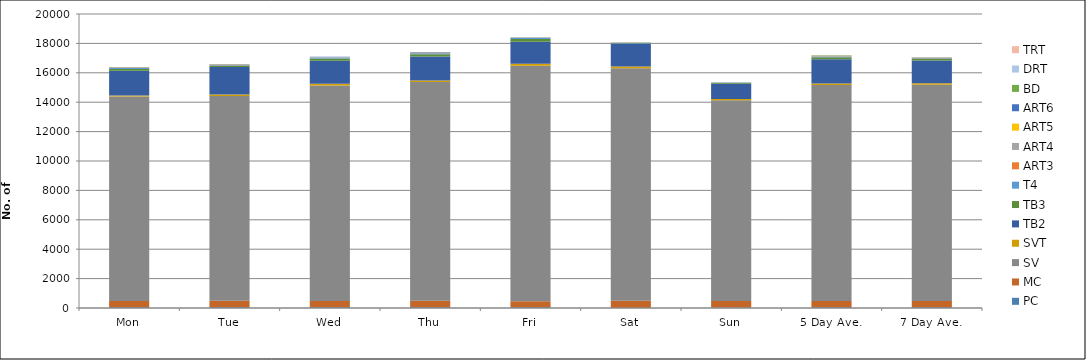
| Category | PC | MC | SV | SVT | TB2 | TB3 | T4 | ART3 | ART4 | ART5 | ART6 | BD | DRT | TRT |
|---|---|---|---|---|---|---|---|---|---|---|---|---|---|---|
| Mon | 45 | 426 | 13909 | 79 | 1683 | 112 | 65 | 19 | 21 | 14 | 17 | 1 | 2 | 1 |
| Tue | 51 | 435 | 13942 | 92 | 1880 | 70 | 45 | 24 | 28 | 10 | 23 | 1 | 3 | 2 |
| Wed | 46 | 435 | 14659 | 112 | 1574 | 148 | 59 | 8 | 27 | 10 | 20 | 2 | 0 | 0 |
| Thu | 52 | 445 | 14884 | 100 | 1626 | 160 | 64 | 8 | 26 | 12 | 32 | 3 | 3 | 0 |
| Fri | 57 | 398 | 16033 | 120 | 1507 | 182 | 65 | 11 | 15 | 12 | 24 | 2 | 3 | 1 |
| Sat | 23 | 465 | 15821 | 128 | 1521 | 41 | 37 | 14 | 17 | 3 | 16 | 0 | 1 | 1 |
| Sun | 31 | 444 | 13651 | 99 | 1036 | 56 | 19 | 8 | 11 | 3 | 6 | 0 | 3 | 0 |
| 5 Day Ave. | 50 | 428 | 14685 | 101 | 1654 | 134 | 60 | 14 | 23 | 12 | 23 | 2 | 2 | 1 |
| 7 Day Ave. | 44 | 435 | 14700 | 104 | 1547 | 110 | 51 | 13 | 21 | 9 | 20 | 1 | 2 | 1 |